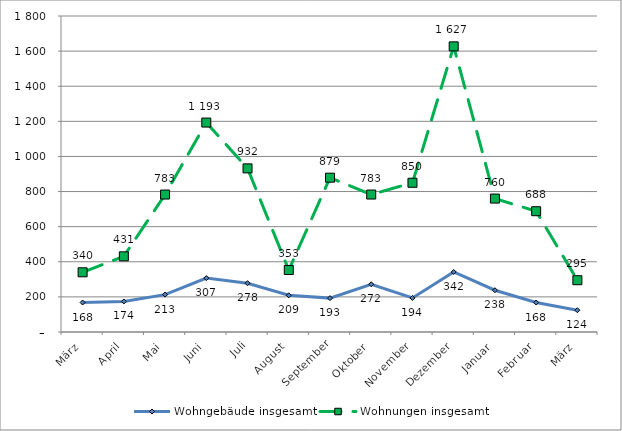
| Category | Wohngebäude insgesamt | Wohnungen insgesamt |
|---|---|---|
| März | 168 | 340 |
| April | 174 | 431 |
| Mai | 213 | 783 |
| Juni | 307 | 1193 |
| Juli | 278 | 932 |
| August | 209 | 353 |
| September | 193 | 879 |
| Oktober | 272 | 783 |
| November | 194 | 850 |
| Dezember | 342 | 1627 |
| Januar | 238 | 760 |
| Februar | 168 | 688 |
| März | 124 | 295 |